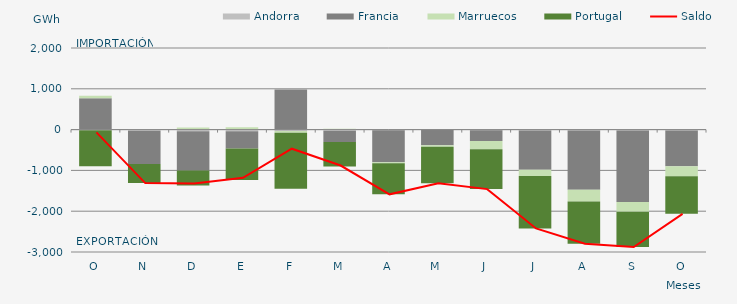
| Category | Andorra | Francia | Marruecos | Portugal |
|---|---|---|---|---|
| O | -15.195 | 769.529 | 59.008 | -880.538 |
| N | -28.632 | -811.796 | -1.998 | -468.519 |
| D | -40.654 | -959.109 | 48.514 | -372.253 |
| E | -38.484 | -427.138 | 57.119 | -771.475 |
| F | -34.803 | 984.059 | -44.168 | -1373 |
| M | -31.125 | -269.834 | 22.023 | -601.362 |
| A | -16.536 | -782.902 | -22.588 | -764.882 |
| M | -5.354 | -378.945 | -37.987 | -891.537 |
| J | -16.539 | -262.937 | -205.078 | -974.176 |
| J | -22.256 | -963.789 | -152.863 | -1283.78 |
| A | -20.355 | -1451.936 | -291.598 | -1034.215 |
| S | -19.779 | -1752.3 | -243.405 | -861.179 |
| O | -20.359 | -877.448 | -247.178 | -920.502 |